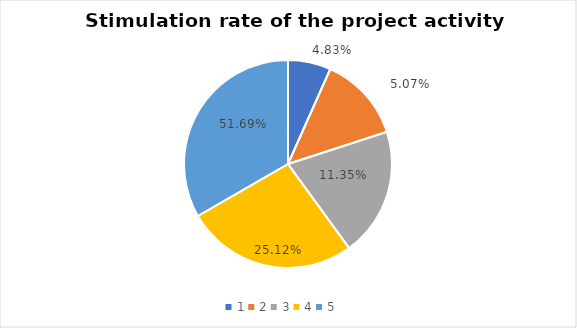
| Category | Series 0 | Series 1 |
|---|---|---|
| 0 | 1 | 0.048 |
| 1 | 2 | 0.051 |
| 2 | 3 | 0.114 |
| 3 | 4 | 0.251 |
| 4 | 5 | 0.517 |